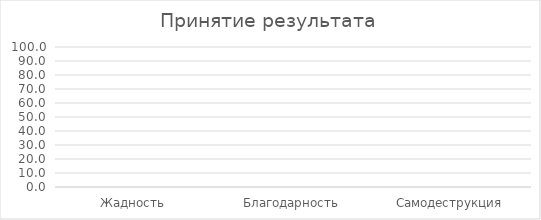
| Category | Series 0 |
|---|---|
| Жадность | 0 |
| Благодарность | 0 |
| Самодеструкция | 0 |